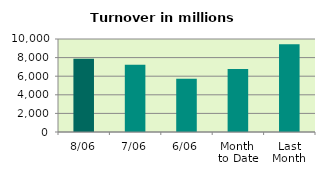
| Category | Series 0 |
|---|---|
| 8/06 | 7875.416 |
| 7/06 | 7221.994 |
| 6/06 | 5725.699 |
| Month 
to Date | 6765.573 |
| Last
Month | 9444.716 |